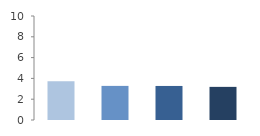
| Category | Rate (%) |
|---|---|
| 2009.0 | 3.734 |
| 2010.0 | 3.279 |
| 2011.0 | 3.274 |
| 2012.0 | 3.185 |